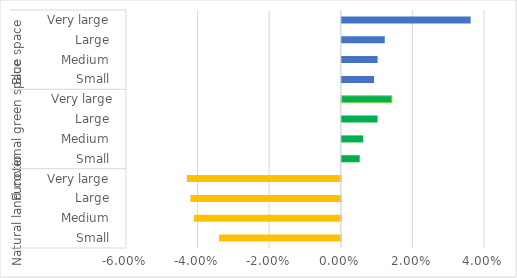
| Category | Series 0 |
|---|---|
| 0 | -0.034 |
| 1 | -0.041 |
| 2 | -0.042 |
| 3 | -0.043 |
| 4 | 0.005 |
| 5 | 0.006 |
| 6 | 0.01 |
| 7 | 0.014 |
| 8 | 0.009 |
| 9 | 0.01 |
| 10 | 0.012 |
| 11 | 0.036 |